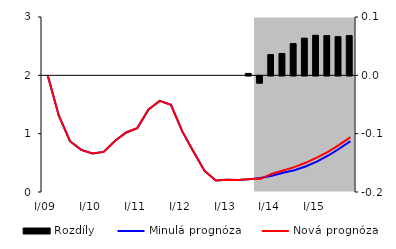
| Category | Rozdíly |
|---|---|
| 0 | 0 |
| 1 | 0 |
| 2 | 0 |
| 3 | 0 |
| 4 | 0 |
| 5 | 0 |
| 6 | 0 |
| 7 | 0 |
| 8 | 0 |
| 9 | 0 |
| 10 | 0 |
| 11 | 0 |
| 12 | 0 |
| 13 | 0 |
| 14 | 0 |
| 15 | 0 |
| 16 | 0 |
| 17 | 0 |
| 18 | 0.003 |
| 19 | -0.012 |
| 20 | 0.036 |
| 21 | 0.038 |
| 22 | 0.054 |
| 23 | 0.064 |
| 24 | 0.069 |
| 25 | 0.068 |
| 26 | 0.066 |
| 27 | 0.068 |